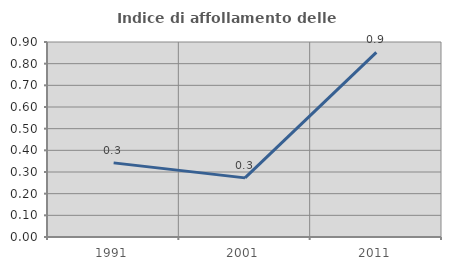
| Category | Indice di affollamento delle abitazioni  |
|---|---|
| 1991.0 | 0.342 |
| 2001.0 | 0.273 |
| 2011.0 | 0.852 |